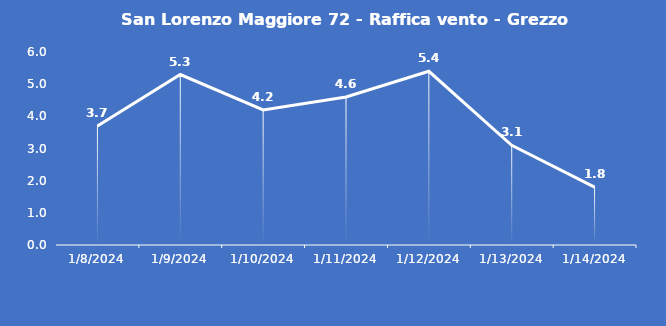
| Category | San Lorenzo Maggiore 72 - Raffica vento - Grezzo (m/s) |
|---|---|
| 1/8/24 | 3.7 |
| 1/9/24 | 5.3 |
| 1/10/24 | 4.2 |
| 1/11/24 | 4.6 |
| 1/12/24 | 5.4 |
| 1/13/24 | 3.1 |
| 1/14/24 | 1.8 |